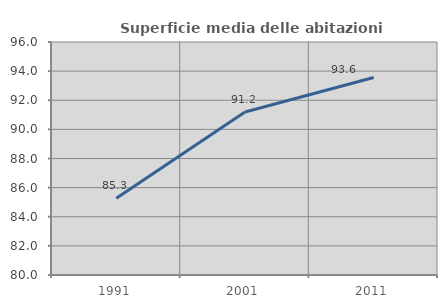
| Category | Superficie media delle abitazioni occupate |
|---|---|
| 1991.0 | 85.271 |
| 2001.0 | 91.195 |
| 2011.0 | 93.558 |